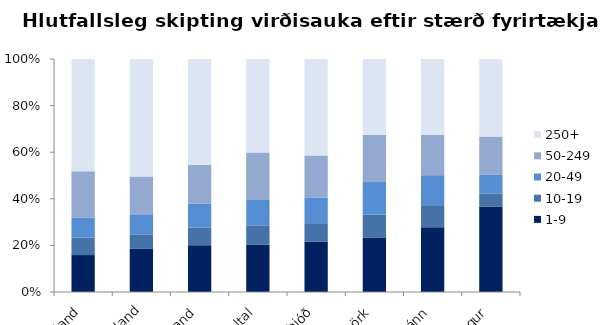
| Category | 1-9 | 10-19 | 20-49 | 50-249 | 250+ |
|---|---|---|---|---|---|
| Þýskaland | 15.857 | 7.476 | 8.663 | 19.849 | 48.155 |
| Bretland | 18.493 | 6.259 | 8.615 | 16.219 | 50.413 |
| Finnland | 20.08 | 7.497 | 10.422 | 16.525 | 45.476 |
| Meðaltal | 20.524 | 8.03 | 11.202 | 20.464 | 40.363 |
| Svíþjóð | 21.678 | 7.867 | 10.95 | 18.078 | 41.427 |
| Danmörk | 23.348 | 9.914 | 13.931 | 20.279 | 32.528 |
| Spánn | 27.822 | 9.444 | 12.871 | 17.31 | 32.553 |
| Noregur | 36.731 | 5.58 | 8.151 | 16.265 | 33.273 |